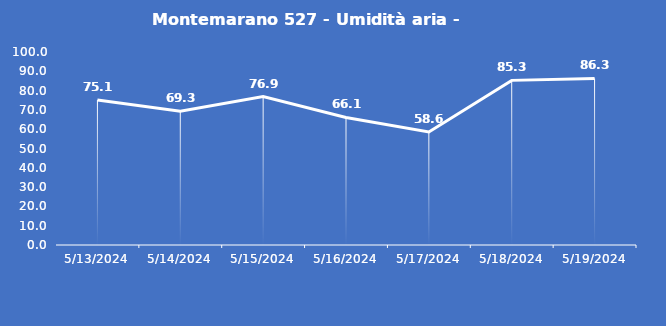
| Category | Montemarano 527 - Umidità aria - Grezzo (%) |
|---|---|
| 5/13/24 | 75.1 |
| 5/14/24 | 69.3 |
| 5/15/24 | 76.9 |
| 5/16/24 | 66.1 |
| 5/17/24 | 58.6 |
| 5/18/24 | 85.3 |
| 5/19/24 | 86.3 |